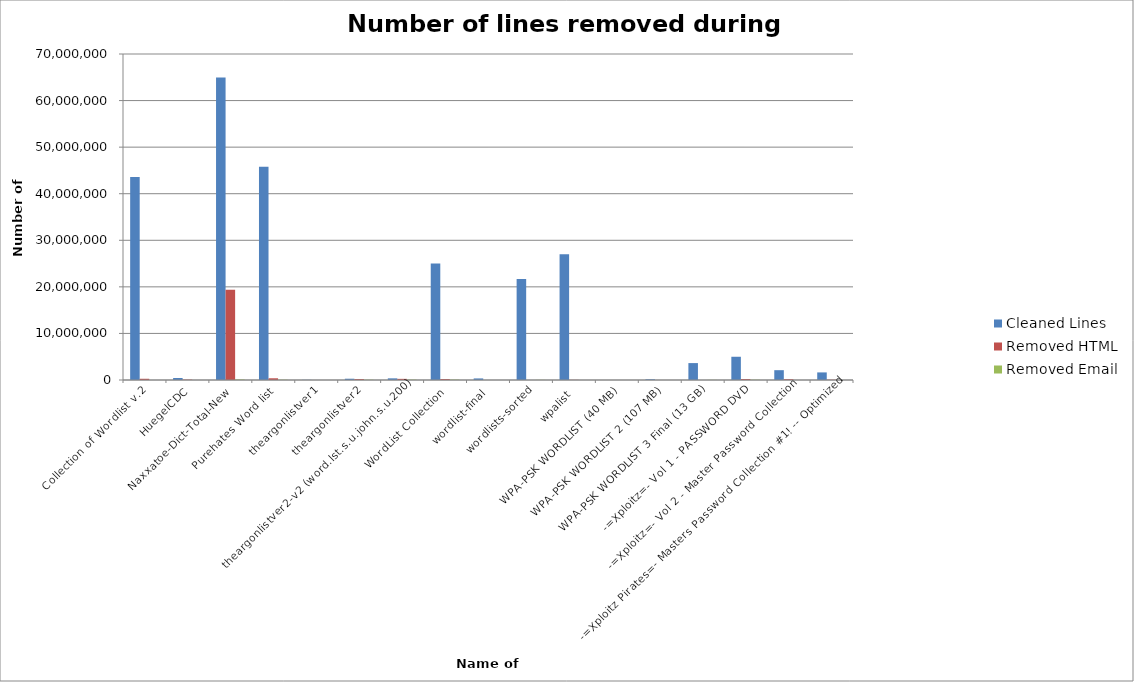
| Category | Cleaned Lines | Removed HTML | Removed Email |
|---|---|---|---|
| Collection of Wordlist v.2 | 43613624 | 263853 | 3315 |
| HuegelCDC | 424165 | 78361 | 394 |
| Naxxatoe-Dict-Total-New | 64954220 | 19358671 | 106622 |
| Purehates Word list | 45801029 | 368164 | 58302 |
| theargonlistver1 | 35440 | 3275 | 198 |
| theargonlistver2 | 274269 | 195594 | 55943 |
| theargonlistver2-v2 (word.lst.s.u.john.s.u.200) | 356143 | 245359 | 75600 |
| WordList Collection | 25008597 | 199299 | 82774 |
| wordlist-final | 337729 | 1225 | 24 |
| wordlists-sorted | 21677846 | 2040 | 27424 |
| wpalist | 27027736 | 28970 | 5481 |
| WPA-PSK WORDLIST (40 MB) | 588 | 78 | 2 |
| WPA-PSK WORDLIST 2 (107 MB) | 146661 | 209 | 7 |
| WPA-PSK WORDLIST 3 Final (13 GB) | 3631642 | 861 | 26692 |
| -=Xploitz=- Vol 1 - PASSWORD DVD | 4990393 | 201268 | 55959 |
| -=Xploitz=- Vol 2 - Master Password Collection | 2109240 | 166103 | 1541 |
| -=Xploitz Pirates=- Masters Password Collection #1! -- Optimized | 1629737 | 57062 | 1214 |